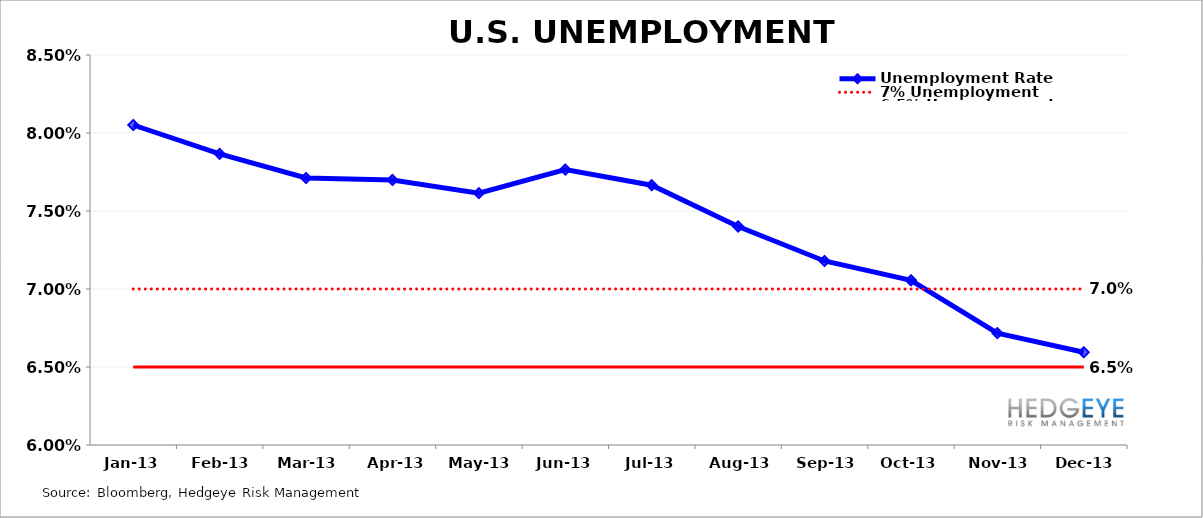
| Category | Unemployment Rate | 7% Unemployment | 6.5% Unemployment |
|---|---|---|---|
| 2013-01-31 | 0.081 | 0.07 | 0.065 |
| 2013-02-28 | 0.079 | 0.07 | 0.065 |
| 2013-03-31 | 0.077 | 0.07 | 0.065 |
| 2013-04-30 | 0.077 | 0.07 | 0.065 |
| 2013-05-31 | 0.076 | 0.07 | 0.065 |
| 2013-06-30 | 0.078 | 0.07 | 0.065 |
| 2013-07-31 | 0.077 | 0.07 | 0.065 |
| 2013-08-31 | 0.074 | 0.07 | 0.065 |
| 2013-09-30 | 0.072 | 0.07 | 0.065 |
| 2013-10-31 | 0.071 | 0.07 | 0.065 |
| 2013-11-30 | 0.067 | 0.07 | 0.065 |
| 2013-12-31 | 0.066 | 0.07 | 0.065 |